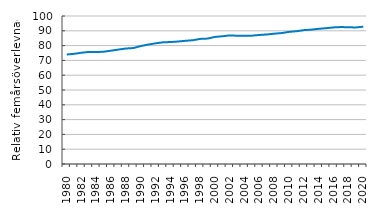
| Category | Series 0 |
|---|---|
| 1980.0 | 73.98 |
| 1981.0 | 74.45 |
| 1982.0 | 75.191 |
| 1983.0 | 75.72 |
| 1984.0 | 75.643 |
| 1985.0 | 75.862 |
| 1986.0 | 76.601 |
| 1987.0 | 77.339 |
| 1988.0 | 78.036 |
| 1989.0 | 78.358 |
| 1990.0 | 79.702 |
| 1991.0 | 80.719 |
| 1992.0 | 81.551 |
| 1993.0 | 82.216 |
| 1994.0 | 82.417 |
| 1995.0 | 82.747 |
| 1996.0 | 83.239 |
| 1997.0 | 83.621 |
| 1998.0 | 84.525 |
| 1999.0 | 84.747 |
| 2000.0 | 85.882 |
| 2001.0 | 86.293 |
| 2002.0 | 86.907 |
| 2003.0 | 86.65 |
| 2004.0 | 86.66 |
| 2005.0 | 86.728 |
| 2006.0 | 87.181 |
| 2007.0 | 87.533 |
| 2008.0 | 88.055 |
| 2009.0 | 88.48 |
| 2010.0 | 89.294 |
| 2011.0 | 89.72 |
| 2012.0 | 90.451 |
| 2013.0 | 90.791 |
| 2014.0 | 91.35 |
| 2015.0 | 91.778 |
| 2016.0 | 92.287 |
| 2017.0 | 92.548 |
| 2018.0 | 92.37 |
| 2019.0 | 92.268 |
| 2020.0 | 92.775 |